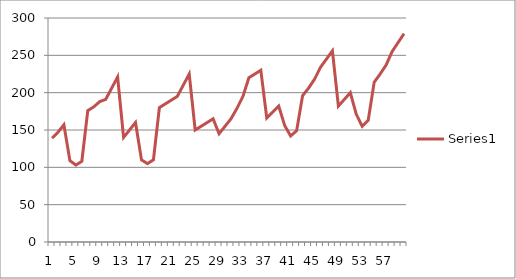
| Category | Series 1 |
|---|---|
| 0 | 139 |
| 1 | 147 |
| 2 | 157 |
| 3 | 109 |
| 4 | 103 |
| 5 | 108 |
| 6 | 176 |
| 7 | 181 |
| 8 | 188 |
| 9 | 191 |
| 10 | 206 |
| 11 | 221 |
| 12 | 140 |
| 13 | 150 |
| 14 | 160 |
| 15 | 110 |
| 16 | 105 |
| 17 | 110 |
| 18 | 180 |
| 19 | 185 |
| 20 | 190 |
| 21 | 195 |
| 22 | 210 |
| 23 | 225 |
| 24 | 150 |
| 25 | 155 |
| 26 | 160 |
| 27 | 165 |
| 28 | 145 |
| 29 | 155 |
| 30 | 165 |
| 31 | 179 |
| 32 | 195 |
| 33 | 220 |
| 34 | 225 |
| 35 | 230 |
| 36 | 166 |
| 37 | 174 |
| 38 | 182 |
| 39 | 156 |
| 40 | 142 |
| 41 | 149 |
| 42 | 196 |
| 43 | 206 |
| 44 | 218 |
| 45 | 234 |
| 46 | 245 |
| 47 | 256 |
| 48 | 182 |
| 49 | 191 |
| 50 | 200 |
| 51 | 171 |
| 52 | 155 |
| 53 | 163 |
| 54 | 214 |
| 55 | 225 |
| 56 | 237 |
| 57 | 255 |
| 58 | 267 |
| 59 | 279 |